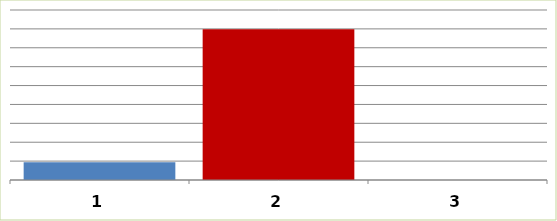
| Category | Series 0 |
|---|---|
| 0 | 4715139 |
| 1 | 39899656 |
| 2 | 0 |